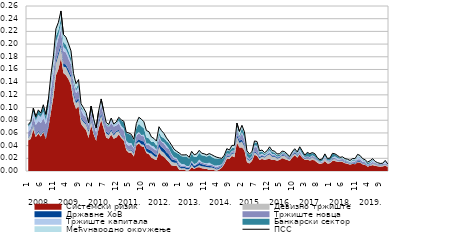
| Category | ПСС |
|---|---|
| 0 | 0.073 |
| 1 | 0.078 |
| 2 | 0.099 |
| 3 | 0.086 |
| 4 | 0.096 |
| 5 | 0.091 |
| 6 | 0.104 |
| 7 | 0.089 |
| 8 | 0.113 |
| 9 | 0.151 |
| 10 | 0.18 |
| 11 | 0.224 |
| 12 | 0.234 |
| 13 | 0.252 |
| 14 | 0.215 |
| 15 | 0.211 |
| 16 | 0.201 |
| 17 | 0.189 |
| 18 | 0.154 |
| 19 | 0.138 |
| 20 | 0.144 |
| 21 | 0.106 |
| 22 | 0.099 |
| 23 | 0.092 |
| 24 | 0.076 |
| 25 | 0.102 |
| 26 | 0.083 |
| 27 | 0.068 |
| 28 | 0.095 |
| 29 | 0.114 |
| 30 | 0.095 |
| 31 | 0.076 |
| 32 | 0.073 |
| 33 | 0.083 |
| 34 | 0.074 |
| 35 | 0.077 |
| 36 | 0.085 |
| 37 | 0.081 |
| 38 | 0.078 |
| 39 | 0.061 |
| 40 | 0.06 |
| 41 | 0.058 |
| 42 | 0.05 |
| 43 | 0.075 |
| 44 | 0.085 |
| 45 | 0.082 |
| 46 | 0.078 |
| 47 | 0.064 |
| 48 | 0.062 |
| 49 | 0.054 |
| 50 | 0.051 |
| 51 | 0.047 |
| 52 | 0.07 |
| 53 | 0.064 |
| 54 | 0.059 |
| 55 | 0.052 |
| 56 | 0.047 |
| 57 | 0.041 |
| 58 | 0.034 |
| 59 | 0.031 |
| 60 | 0.029 |
| 61 | 0.025 |
| 62 | 0.025 |
| 63 | 0.026 |
| 64 | 0.021 |
| 65 | 0.031 |
| 66 | 0.026 |
| 67 | 0.027 |
| 68 | 0.033 |
| 69 | 0.028 |
| 70 | 0.027 |
| 71 | 0.025 |
| 72 | 0.027 |
| 73 | 0.026 |
| 74 | 0.023 |
| 75 | 0.022 |
| 76 | 0.021 |
| 77 | 0.02 |
| 78 | 0.025 |
| 79 | 0.035 |
| 80 | 0.033 |
| 81 | 0.04 |
| 82 | 0.04 |
| 83 | 0.076 |
| 84 | 0.062 |
| 85 | 0.072 |
| 86 | 0.062 |
| 87 | 0.032 |
| 88 | 0.027 |
| 89 | 0.031 |
| 90 | 0.047 |
| 91 | 0.047 |
| 92 | 0.032 |
| 93 | 0.033 |
| 94 | 0.029 |
| 95 | 0.032 |
| 96 | 0.038 |
| 97 | 0.032 |
| 98 | 0.031 |
| 99 | 0.027 |
| 100 | 0.027 |
| 101 | 0.031 |
| 102 | 0.03 |
| 103 | 0.027 |
| 104 | 0.023 |
| 105 | 0.03 |
| 106 | 0.035 |
| 107 | 0.03 |
| 108 | 0.038 |
| 109 | 0.032 |
| 110 | 0.025 |
| 111 | 0.029 |
| 112 | 0.027 |
| 113 | 0.029 |
| 114 | 0.027 |
| 115 | 0.021 |
| 116 | 0.018 |
| 117 | 0.019 |
| 118 | 0.027 |
| 119 | 0.02 |
| 120 | 0.02 |
| 121 | 0.028 |
| 122 | 0.027 |
| 123 | 0.025 |
| 124 | 0.021 |
| 125 | 0.022 |
| 126 | 0.02 |
| 127 | 0.019 |
| 128 | 0.017 |
| 129 | 0.02 |
| 130 | 0.02 |
| 131 | 0.026 |
| 132 | 0.024 |
| 133 | 0.02 |
| 134 | 0.018 |
| 135 | 0.014 |
| 136 | 0.016 |
| 137 | 0.019 |
| 138 | 0.015 |
| 139 | 0.013 |
| 140 | 0.012 |
| 141 | 0.012 |
| 142 | 0.017 |
| 143 | 0.011 |